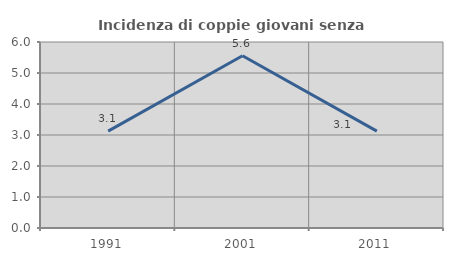
| Category | Incidenza di coppie giovani senza figli |
|---|---|
| 1991.0 | 3.125 |
| 2001.0 | 5.556 |
| 2011.0 | 3.125 |